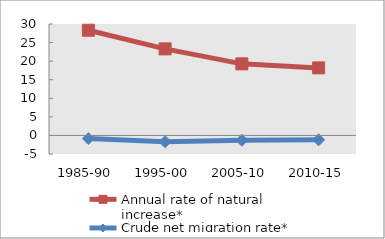
| Category | Annual rate of natural increase* | Crude net migration rate* |
|---|---|---|
| 1985-90 | 28.322 | -0.85 |
| 1995-00 | 23.301 | -1.693 |
| 2005-10 | 19.267 | -1.294 |
| 2010-15 | 18.18 | -1.186 |